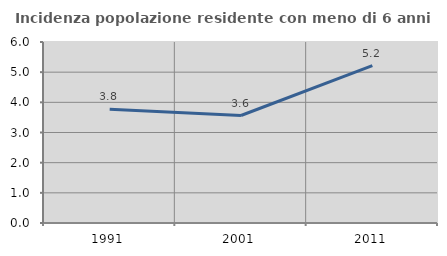
| Category | Incidenza popolazione residente con meno di 6 anni |
|---|---|
| 1991.0 | 3.769 |
| 2001.0 | 3.563 |
| 2011.0 | 5.215 |